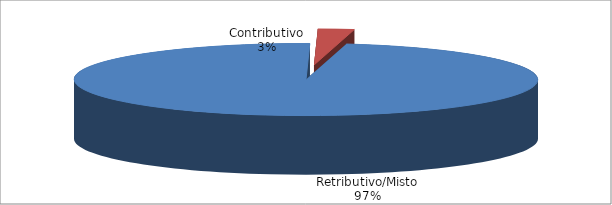
| Category | Series 1 |
|---|---|
| Retributivo/Misto | 68090 |
| Contributivo | 1757 |